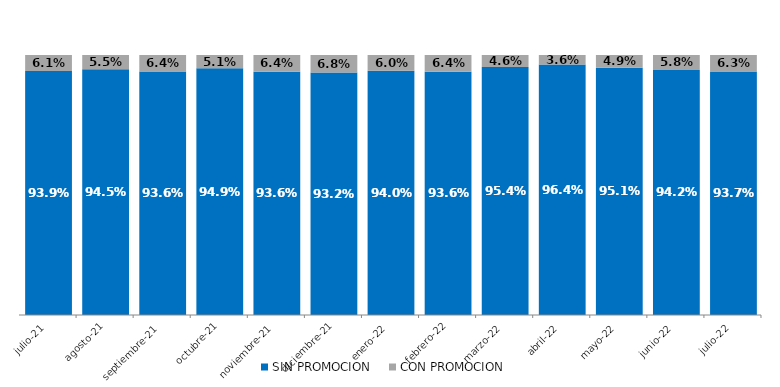
| Category | SIN PROMOCION   | CON PROMOCION   |
|---|---|---|
| 2021-07-01 | 0.939 | 0.061 |
| 2021-08-01 | 0.945 | 0.055 |
| 2021-09-01 | 0.936 | 0.064 |
| 2021-10-01 | 0.949 | 0.051 |
| 2021-11-01 | 0.936 | 0.064 |
| 2021-12-01 | 0.932 | 0.068 |
| 2022-01-01 | 0.94 | 0.06 |
| 2022-02-01 | 0.936 | 0.064 |
| 2022-03-01 | 0.954 | 0.046 |
| 2022-04-01 | 0.964 | 0.036 |
| 2022-05-01 | 0.951 | 0.049 |
| 2022-06-01 | 0.942 | 0.058 |
| 2022-07-01 | 0.937 | 0.063 |